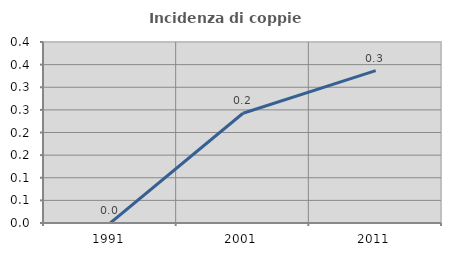
| Category | Incidenza di coppie miste |
|---|---|
| 1991.0 | 0 |
| 2001.0 | 0.243 |
| 2011.0 | 0.337 |